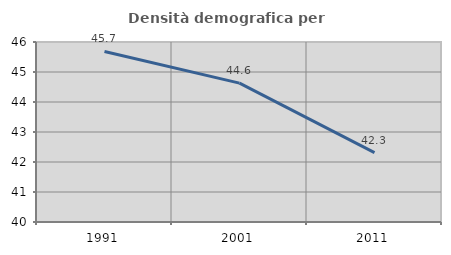
| Category | Densità demografica |
|---|---|
| 1991.0 | 45.684 |
| 2001.0 | 44.63 |
| 2011.0 | 42.315 |